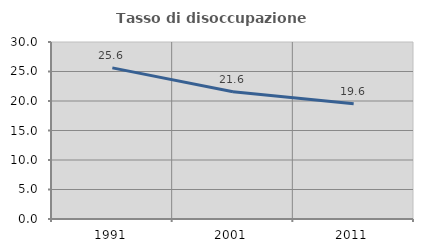
| Category | Tasso di disoccupazione giovanile  |
|---|---|
| 1991.0 | 25.616 |
| 2001.0 | 21.583 |
| 2011.0 | 19.553 |